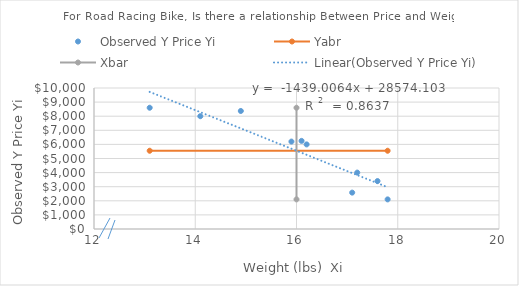
| Category | Observed Y Price Yi |
|---|---|
| 17.8 | 2100 |
| 16.1 | 6250 |
| 14.9 | 8370 |
| 15.9 | 6200 |
| 17.2 | 4000 |
| 13.1 | 8600 |
| 16.2 | 6000 |
| 17.1 | 2580 |
| 17.6 | 3400 |
| 14.1 | 8000 |